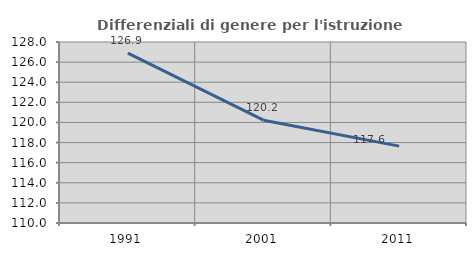
| Category | Differenziali di genere per l'istruzione superiore |
|---|---|
| 1991.0 | 126.898 |
| 2001.0 | 120.225 |
| 2011.0 | 117.645 |